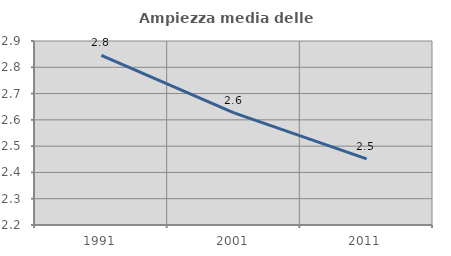
| Category | Ampiezza media delle famiglie |
|---|---|
| 1991.0 | 2.845 |
| 2001.0 | 2.626 |
| 2011.0 | 2.452 |